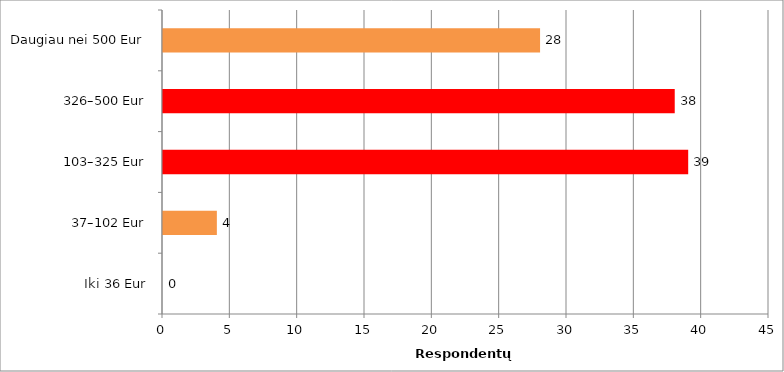
| Category | Series 0 |
|---|---|
| Iki 36 Eur | 0 |
| 37–102 Eur | 4 |
| 103–325 Eur | 39 |
| 326–500 Eur | 38 |
| Daugiau nei 500 Eur | 28 |